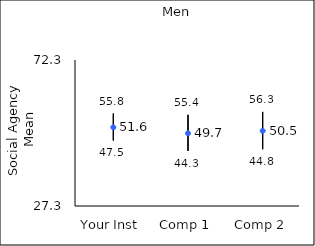
| Category | 25th percentile | 75th percentile | Mean |
|---|---|---|---|
| Your Inst | 47.5 | 55.8 | 51.55 |
| Comp 1 | 44.3 | 55.4 | 49.72 |
| Comp 2 | 44.8 | 56.3 | 50.46 |